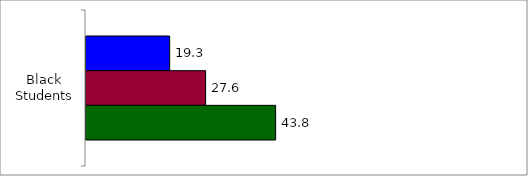
| Category | 50 States and D.C. | SREB States | State |
|---|---|---|---|
| 0 | 19.327 | 27.626 | 43.791 |